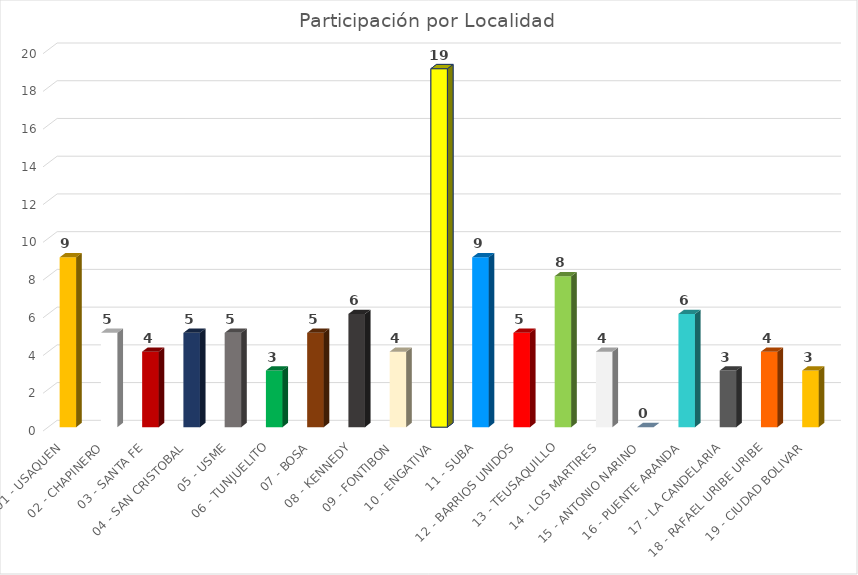
| Category | Peticiones |
|---|---|
| 01 - USAQUEN | 9 |
| 02 - CHAPINERO | 5 |
| 03 - SANTA FE | 4 |
| 04 - SAN CRISTOBAL | 5 |
| 05 - USME | 5 |
| 06 - TUNJUELITO | 3 |
| 07 - BOSA | 5 |
| 08 - KENNEDY | 6 |
| 09 - FONTIBON | 4 |
| 10 - ENGATIVA | 19 |
| 11 - SUBA | 9 |
| 12 - BARRIOS UNIDOS | 5 |
| 13 - TEUSAQUILLO | 8 |
| 14 - LOS MARTIRES | 4 |
| 15 - ANTONIO NARINO | 0 |
| 16 - PUENTE ARANDA | 6 |
| 17 - LA CANDELARIA | 3 |
| 18 - RAFAEL URIBE URIBE | 4 |
| 19 - CIUDAD BOLIVAR | 3 |